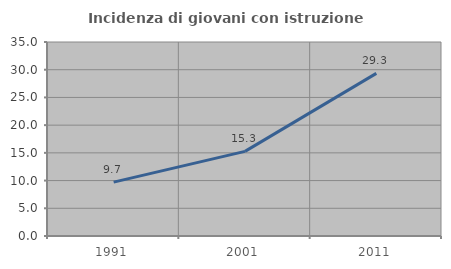
| Category | Incidenza di giovani con istruzione universitaria |
|---|---|
| 1991.0 | 9.721 |
| 2001.0 | 15.262 |
| 2011.0 | 29.342 |